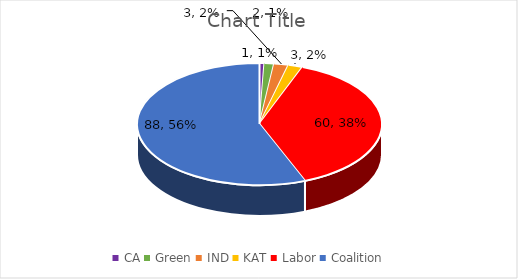
| Category | Series 0 |
|---|---|
| CA | 1 |
| Green | 2 |
| IND | 3 |
| KAT | 3 |
| Labor | 60 |
| Coalition | 88 |